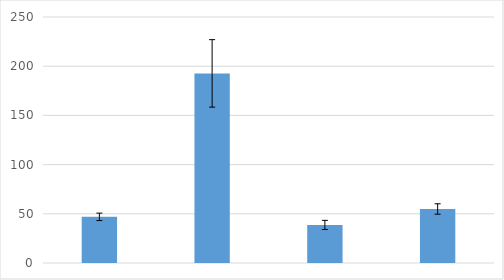
| Category | Series 0 |
|---|---|
| 0 | 46.9 |
| 1 | 192.7 |
| 2 | 38.7 |
| 3 | 54.9 |